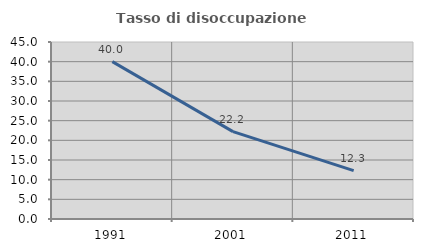
| Category | Tasso di disoccupazione giovanile  |
|---|---|
| 1991.0 | 40 |
| 2001.0 | 22.222 |
| 2011.0 | 12.281 |